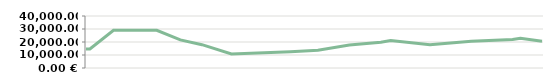
| Category | KUU   |
|---|---|
| 2013-04-23 | 14600 |
| 2013-04-25 | 14600 |
| 2013-05-07 | 29000 |
| 2013-05-14 | 29000 |
| 2013-05-14 | 29000 |
| 2013-05-29 | 29000 |
| 2013-06-10 | 21600 |
| 2013-06-21 | 17950 |
| 2013-07-06 | 10776.471 |
| 2013-08-05 | 12455.862 |
| 2013-08-19 | 13667.568 |
| 2013-09-04 | 17651.667 |
| 2013-09-20 | 19877.912 |
| 2013-09-25 | 21138.05 |
| 2013-10-15 | 17951.744 |
| 2013-11-05 | 20556.13 |
| 2013-11-26 | 21997.139 |
| 2013-11-30 | 22917.635 |
| 2013-12-11 | 20504.315 |